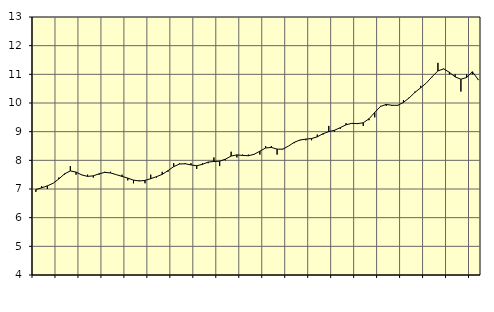
| Category | Piggar | Offentlig förvaltning m.m., SNI 84, 99 |
|---|---|---|
| nan | 6.9 | 6.98 |
| 1.0 | 7.1 | 7.04 |
| 1.0 | 7 | 7.11 |
| 1.0 | 7.2 | 7.2 |
| nan | 7.4 | 7.35 |
| 2.0 | 7.5 | 7.53 |
| 2.0 | 7.8 | 7.63 |
| 2.0 | 7.5 | 7.59 |
| nan | 7.5 | 7.49 |
| 3.0 | 7.5 | 7.44 |
| 3.0 | 7.4 | 7.46 |
| 3.0 | 7.5 | 7.53 |
| nan | 7.6 | 7.58 |
| 4.0 | 7.6 | 7.56 |
| 4.0 | 7.5 | 7.5 |
| 4.0 | 7.5 | 7.44 |
| nan | 7.3 | 7.38 |
| 5.0 | 7.2 | 7.31 |
| 5.0 | 7.3 | 7.28 |
| 5.0 | 7.2 | 7.3 |
| nan | 7.5 | 7.36 |
| 6.0 | 7.4 | 7.43 |
| 6.0 | 7.6 | 7.51 |
| 6.0 | 7.6 | 7.64 |
| nan | 7.9 | 7.78 |
| 7.0 | 7.9 | 7.87 |
| 7.0 | 7.9 | 7.88 |
| 7.0 | 7.9 | 7.84 |
| nan | 7.7 | 7.81 |
| 8.0 | 7.9 | 7.86 |
| 8.0 | 7.9 | 7.94 |
| 8.0 | 8.1 | 7.96 |
| nan | 7.8 | 7.97 |
| 9.0 | 8 | 8.04 |
| 9.0 | 8.3 | 8.15 |
| 9.0 | 8.1 | 8.19 |
| nan | 8.2 | 8.17 |
| 10.0 | 8.2 | 8.16 |
| 10.0 | 8.2 | 8.21 |
| 10.0 | 8.2 | 8.32 |
| nan | 8.5 | 8.43 |
| 11.0 | 8.5 | 8.45 |
| 11.0 | 8.2 | 8.39 |
| 11.0 | 8.4 | 8.39 |
| nan | 8.5 | 8.5 |
| 12.0 | 8.6 | 8.63 |
| 12.0 | 8.7 | 8.71 |
| 12.0 | 8.7 | 8.74 |
| nan | 8.7 | 8.76 |
| 13.0 | 8.9 | 8.82 |
| 13.0 | 8.9 | 8.93 |
| 13.0 | 9.2 | 9 |
| nan | 9 | 9.05 |
| 14.0 | 9.1 | 9.14 |
| 14.0 | 9.3 | 9.24 |
| 14.0 | 9.3 | 9.29 |
| nan | 9.3 | 9.28 |
| 15.0 | 9.2 | 9.31 |
| 15.0 | 9.4 | 9.45 |
| 15.0 | 9.5 | 9.67 |
| nan | 9.9 | 9.88 |
| 16.0 | 9.9 | 9.95 |
| 16.0 | 9.9 | 9.92 |
| 16.0 | 9.9 | 9.92 |
| nan | 10.1 | 10.02 |
| 17.0 | 10.2 | 10.18 |
| 17.0 | 10.4 | 10.37 |
| 17.0 | 10.6 | 10.53 |
| nan | 10.7 | 10.7 |
| 18.0 | 10.9 | 10.92 |
| 18.0 | 11.4 | 11.12 |
| 18.0 | 11.2 | 11.19 |
| nan | 11 | 11.07 |
| 19.0 | 11 | 10.91 |
| 19.0 | 10.4 | 10.83 |
| 19.0 | 11 | 10.89 |
| nan | 11 | 11.09 |
| 20.0 | 10.8 | 10.82 |